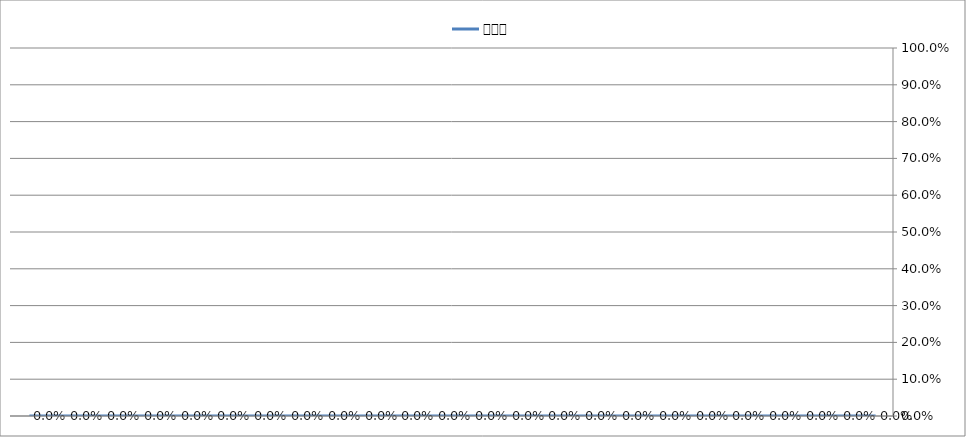
| Category | Ａ／Ｖ |
|---|---|
|  | 0 |
|  | 0 |
|  | 0 |
|  | 0 |
|  | 0 |
|  | 0 |
|  | 0 |
|  | 0 |
|  | 0 |
|  | 0 |
|  | 0 |
|  | 0 |
|  | 0 |
|  | 0 |
|  | 0 |
|  | 0 |
|  | 0 |
|  | 0 |
|  | 0 |
|  | 0 |
|  | 0 |
|  | 0 |
|  | 0 |
|  | 0 |